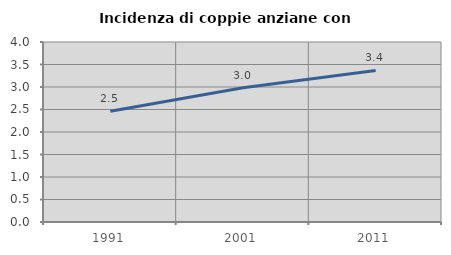
| Category | Incidenza di coppie anziane con figli |
|---|---|
| 1991.0 | 2.46 |
| 2001.0 | 2.984 |
| 2011.0 | 3.367 |